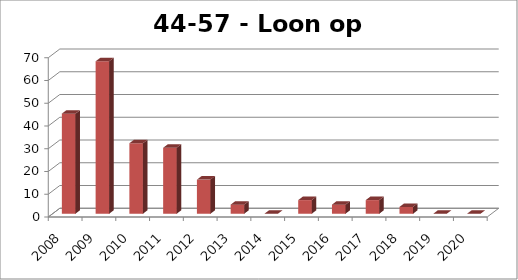
| Category | Loon op Zand |
|---|---|
| 2008.0 | 44 |
| 2009.0 | 67 |
| 2010.0 | 31 |
| 2011.0 | 29 |
| 2012.0 | 15 |
| 2013.0 | 4 |
| 2014.0 | 0 |
| 2015.0 | 6 |
| 2016.0 | 4 |
| 2017.0 | 6 |
| 2018.0 | 3 |
| 2019.0 | 0 |
| 2020.0 | 0 |